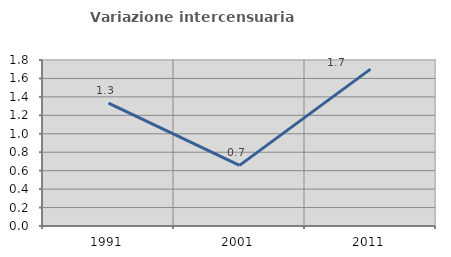
| Category | Variazione intercensuaria annua |
|---|---|
| 1991.0 | 1.332 |
| 2001.0 | 0.658 |
| 2011.0 | 1.701 |